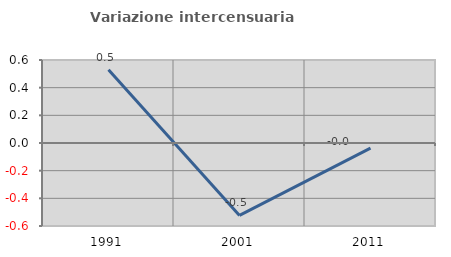
| Category | Variazione intercensuaria annua |
|---|---|
| 1991.0 | 0.53 |
| 2001.0 | -0.523 |
| 2011.0 | -0.037 |